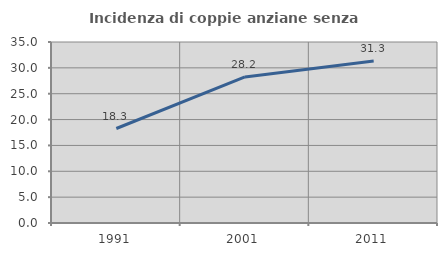
| Category | Incidenza di coppie anziane senza figli  |
|---|---|
| 1991.0 | 18.272 |
| 2001.0 | 28.249 |
| 2011.0 | 31.343 |